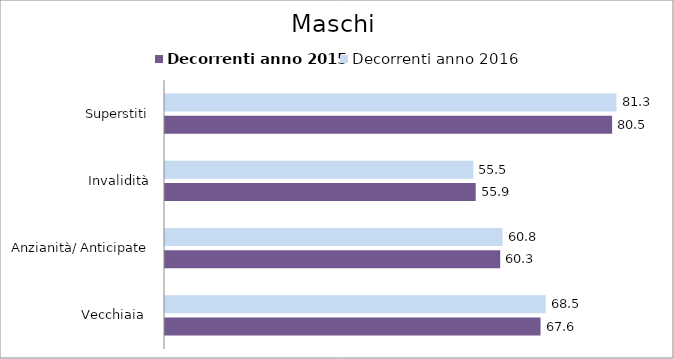
| Category | Decorrenti anno 2015 | Decorrenti anno 2016 |
|---|---|---|
| Vecchiaia  | 67.6 | 68.52 |
| Anzianità/ Anticipate | 60.34 | 60.75 |
| Invalidità | 55.93 | 55.5 |
| Superstiti | 80.48 | 81.27 |